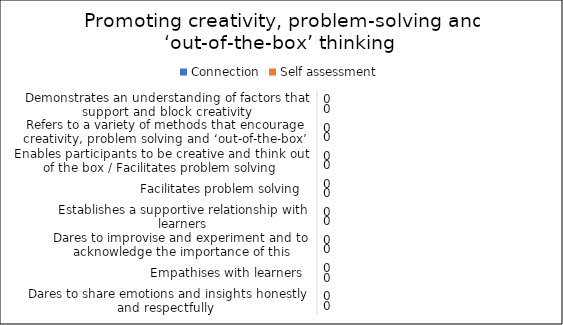
| Category | Connection | Self assessment |
|---|---|---|
| Demonstrates an understanding of factors that support and block creativity | 0 | 0 |
| Refers to a variety of methods that encourage creativity, problem solving and ‘out-of-the-box’ thinking  | 0 | 0 |
| Enables participants to be creative and think out of the box / Facilitates problem solving | 0 | 0 |
| Facilitates problem solving  | 0 | 0 |
| Establishes a supportive relationship with learners | 0 | 0 |
| Dares to improvise and experiment and to acknowledge the importance of this | 0 | 0 |
| Empathises with learners  | 0 | 0 |
| Dares to share emotions and insights honestly and respectfully  | 0 | 0 |